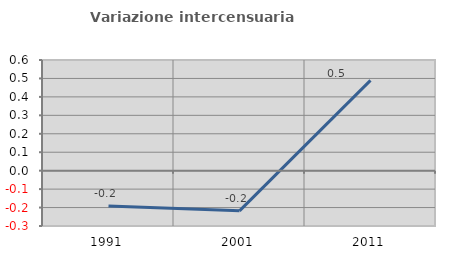
| Category | Variazione intercensuaria annua |
|---|---|
| 1991.0 | -0.191 |
| 2001.0 | -0.218 |
| 2011.0 | 0.489 |